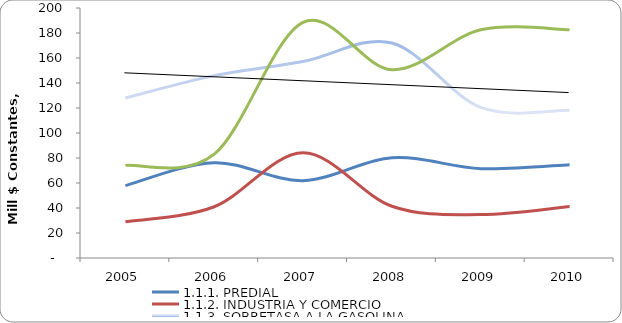
| Category | 1.1.1. PREDIAL | 1.1.2. INDUSTRIA Y COMERCIO | 1.1.3. SOBRETASA A LA GASOLINA | 1.1.4. OTROS |
|---|---|---|---|---|
| 2005 | 57.867 | 28.98 | 127.95 | 74.098 |
| 2006 | 76.266 | 41.003 | 145.877 | 83.039 |
| 2007 | 61.882 | 84.173 | 157.172 | 188.551 |
| 2008 | 80.183 | 41.398 | 171.971 | 150.638 |
| 2009 | 71.492 | 34.728 | 120.433 | 182.558 |
| 2010 | 74.643 | 41.146 | 118.122 | 182.67 |